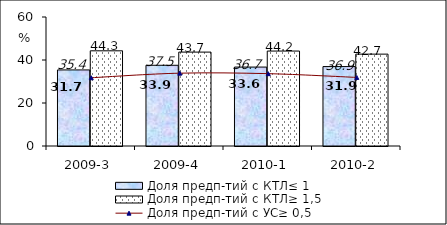
| Category | Доля предп-тий с КТЛ≤ 1 | Доля предп-тий с КТЛ≥ 1,5 |
|---|---|---|
| 2009-3 | 35.38 | 44.27 |
| 2009-4 | 37.55 | 43.675 |
| 2010-1 | 36.708 | 44.162 |
| 2010-2 | 36.944 | 42.73 |